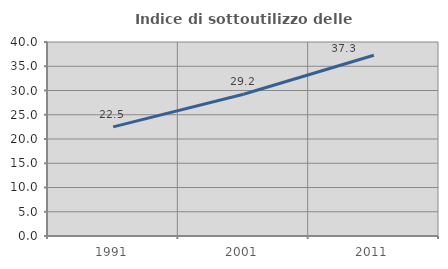
| Category | Indice di sottoutilizzo delle abitazioni  |
|---|---|
| 1991.0 | 22.499 |
| 2001.0 | 29.232 |
| 2011.0 | 37.264 |